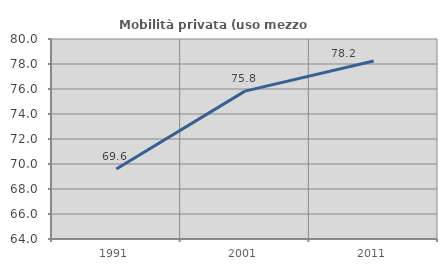
| Category | Mobilità privata (uso mezzo privato) |
|---|---|
| 1991.0 | 69.595 |
| 2001.0 | 75.827 |
| 2011.0 | 78.242 |